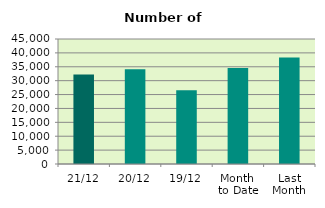
| Category | Series 0 |
|---|---|
| 21/12 | 32244 |
| 20/12 | 34148 |
| 19/12 | 26554 |
| Month 
to Date | 34568.8 |
| Last
Month | 38326.182 |